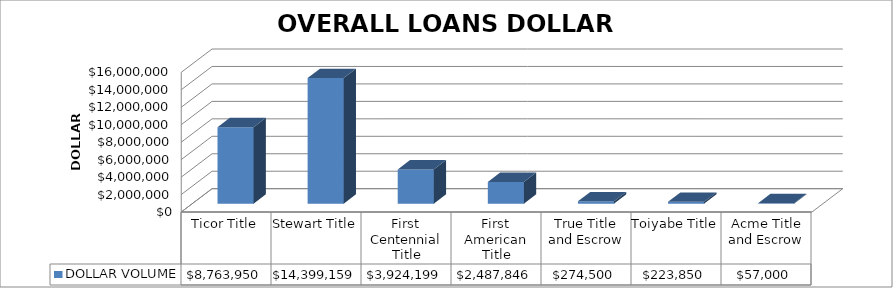
| Category | DOLLAR VOLUME |
|---|---|
| Ticor Title | 8763950 |
| Stewart Title | 14399159 |
| First Centennial Title | 3924199 |
| First American Title | 2487846 |
| True Title and Escrow | 274500 |
| Toiyabe Title | 223850 |
| Acme Title and Escrow | 57000 |